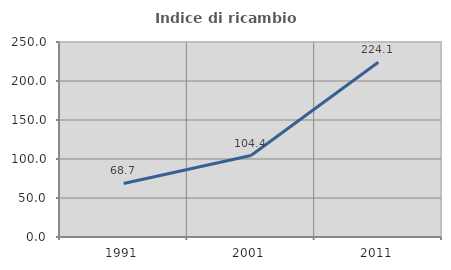
| Category | Indice di ricambio occupazionale  |
|---|---|
| 1991.0 | 68.698 |
| 2001.0 | 104.43 |
| 2011.0 | 224.076 |